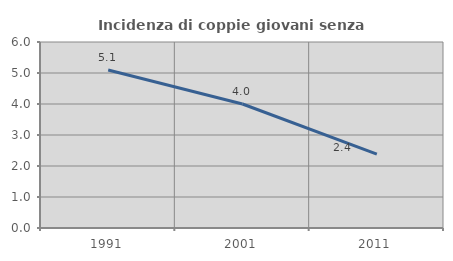
| Category | Incidenza di coppie giovani senza figli |
|---|---|
| 1991.0 | 5.096 |
| 2001.0 | 4 |
| 2011.0 | 2.381 |